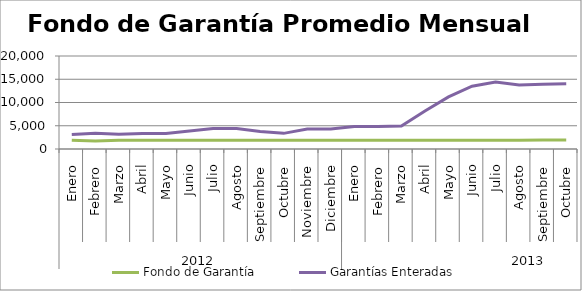
| Category | Fondo de Garantía | Garantías Enteradas |
|---|---|---|
| 0 | 1896.798 | 3141.641 |
| 1 | 1714.423 | 3362.648 |
| 2 | 1900.513 | 3154.118 |
| 3 | 1900.513 | 3348.058 |
| 4 | 1898.685 | 3308.859 |
| 5 | 1900.513 | 3850.375 |
| 6 | 1900.513 | 4400.539 |
| 7 | 1895.388 | 4383.327 |
| 8 | 1900.513 | 3757.632 |
| 9 | 1900.513 | 3362.932 |
| 10 | 1900.311 | 4285.609 |
| 11 | 1890.98 | 4296.87 |
| 12 | 1898.667 | 4842.786 |
| 13 | 1900.512 | 4845.136 |
| 14 | 1900.513 | 4938.365 |
| 15 | 1900.513 | 8179.666 |
| 16 | 1900.513 | 11202.213 |
| 17 | 1900.513 | 13493.433 |
| 18 | 1900.513 | 14387.844 |
| 19 | 1900.496 | 13769.803 |
| 20 | 1951.853 | 13899.147 |
| 21 | 1948.554 | 14005.922 |